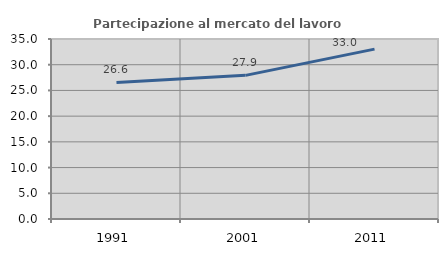
| Category | Partecipazione al mercato del lavoro  femminile |
|---|---|
| 1991.0 | 26.554 |
| 2001.0 | 27.928 |
| 2011.0 | 33.026 |